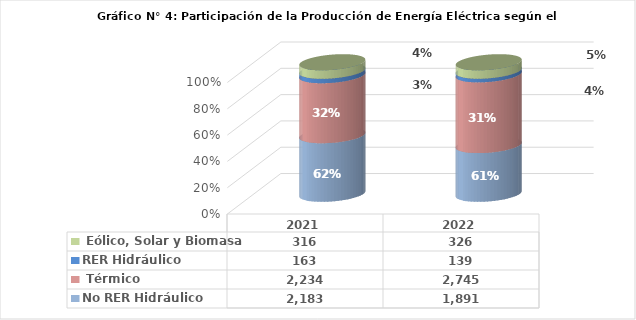
| Category | No RER | RER |
|---|---|---|
| 2021.0 | 2234.468 | 315.777 |
| 2022.0 | 2745.016 | 326.281 |